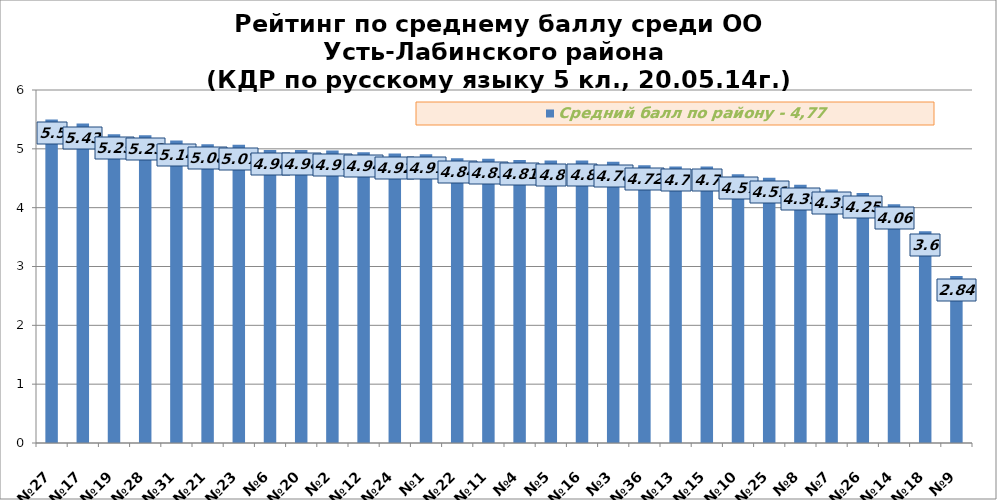
| Category | Средний балл по району - 4,77 |
|---|---|
| №27 | 5.5 |
| №17 | 5.43 |
| №19 | 5.25 |
| №28 | 5.23 |
| №31 | 5.14 |
| №21 | 5.08 |
| №23 | 5.07 |
| №6 | 4.98 |
| №20 | 4.98 |
| №2 | 4.97 |
| №12 | 4.94 |
| №24 | 4.92 |
| №1 | 4.91 |
| №22 | 4.84 |
| №11 | 4.83 |
| №4 | 4.81 |
| №5 | 4.8 |
| №16 | 4.8 |
| №3 | 4.78 |
| №36 | 4.72 |
| №13 | 4.7 |
| №15 | 4.7 |
| №10 | 4.57 |
| №25 | 4.51 |
| №8 | 4.39 |
| №7 | 4.31 |
| №26 | 4.25 |
| №14 | 4.06 |
| №18 | 3.6 |
| №9 | 2.84 |